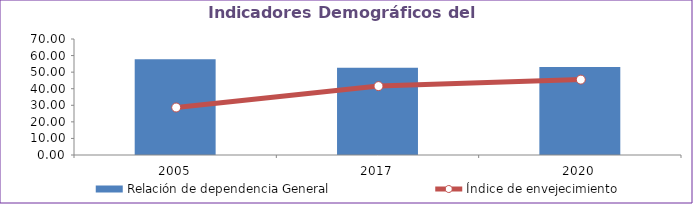
| Category | Relación de dependencia General |
|---|---|
| 2005.0 | 57.851 |
| 2017.0 | 52.598 |
| 2020.0 | 53.033 |